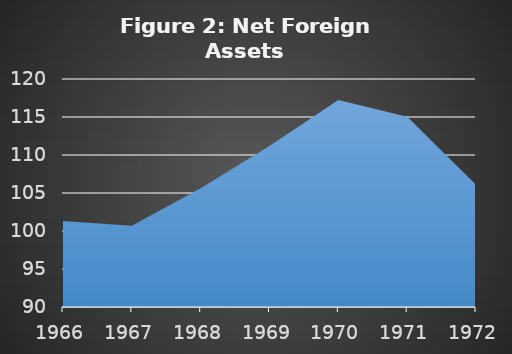
| Category | Series 0 |
|---|---|
| 1966.0 | 101.314 |
| 1967.0 | 100.699 |
| 1968.0 | 105.621 |
| 1969.0 | 111.172 |
| 1970.0 | 117.253 |
| 1971.0 | 115.027 |
| 1972.0 | 106.079 |